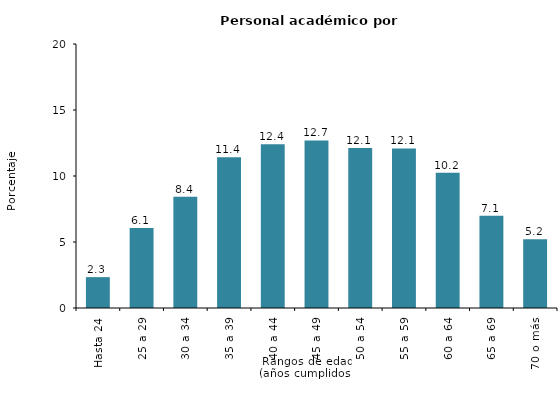
| Category | Series 0 |
|---|---|
| Hasta 24 | 2.338 |
| 25 a 29 | 6.053 |
| 30 a 34 | 8.425 |
| 35 a 39 | 11.428 |
| 40 a 44 | 12.406 |
| 45 a 49 | 12.694 |
| 50 a 54 | 12.125 |
| 55 a 59 | 12.087 |
| 60 a 64 | 10.243 |
| 65 a 69 | 6.987 |
| 70 o más | 5.213 |